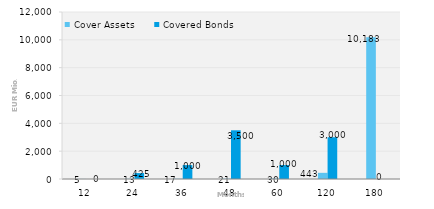
| Category | Cover Assets | Covered Bonds |
|---|---|---|
| 12.0 | 5.238 | 0 |
| 24.0 | 12.955 | 425 |
| 36.0 | 17.485 | 1000 |
| 48.0 | 21.448 | 3500 |
| 60.0 | 29.548 | 1000 |
| 120.0 | 443.06 | 3000 |
| 180.0 | 10183.071 | 0 |